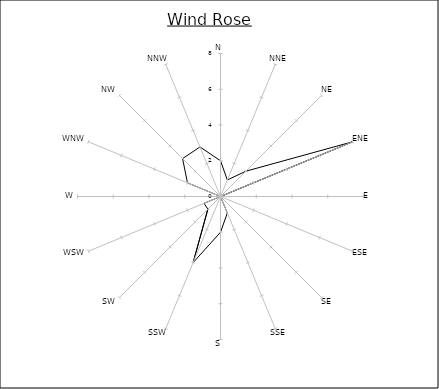
| Category | Series 0 |
|---|---|
| N | 2 |
| NNE | 1 |
| NE | 2 |
| ENE | 8 |
| E | 0 |
| ESE | 0 |
| SE | 0 |
| SSE | 1 |
| S | 2 |
| SSW | 4 |
| SW | 1 |
| WSW | 1 |
| W | 0 |
| WNW | 2 |
| NW | 3 |
| NNW | 3 |